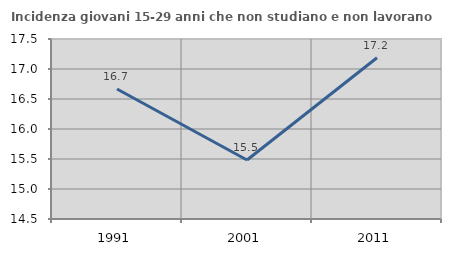
| Category | Incidenza giovani 15-29 anni che non studiano e non lavorano  |
|---|---|
| 1991.0 | 16.667 |
| 2001.0 | 15.484 |
| 2011.0 | 17.188 |